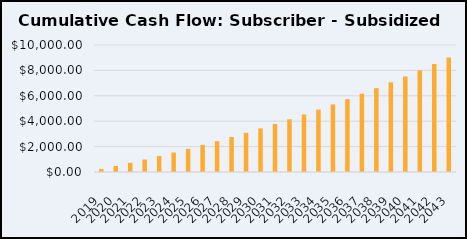
| Category | Series 0 |
|---|---|
| 2019.0 | 232.446 |
| 2020.0 | 473.911 |
| 2021.0 | 724.591 |
| 2022.0 | 984.683 |
| 2023.0 | 1254.388 |
| 2024.0 | 1533.911 |
| 2025.0 | 1823.463 |
| 2026.0 | 2123.257 |
| 2027.0 | 2433.51 |
| 2028.0 | 2754.445 |
| 2029.0 | 3086.287 |
| 2030.0 | 3429.267 |
| 2031.0 | 3783.62 |
| 2032.0 | 4149.585 |
| 2033.0 | 4527.406 |
| 2034.0 | 4917.331 |
| 2035.0 | 5319.614 |
| 2036.0 | 5734.512 |
| 2037.0 | 6162.287 |
| 2038.0 | 6603.207 |
| 2039.0 | 7057.544 |
| 2040.0 | 7525.576 |
| 2041.0 | 8007.584 |
| 2042.0 | 8503.856 |
| 2043.0 | 9014.685 |